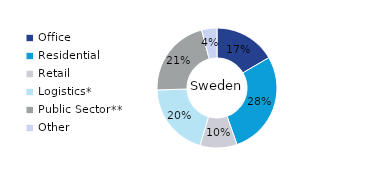
| Category | Sweden |
|---|---|
| Office | 0.166 |
| Residential | 0.28 |
| Retail | 0.1 |
| Logistics* | 0.199 |
| Public Sector** | 0.214 |
| Other | 0.041 |